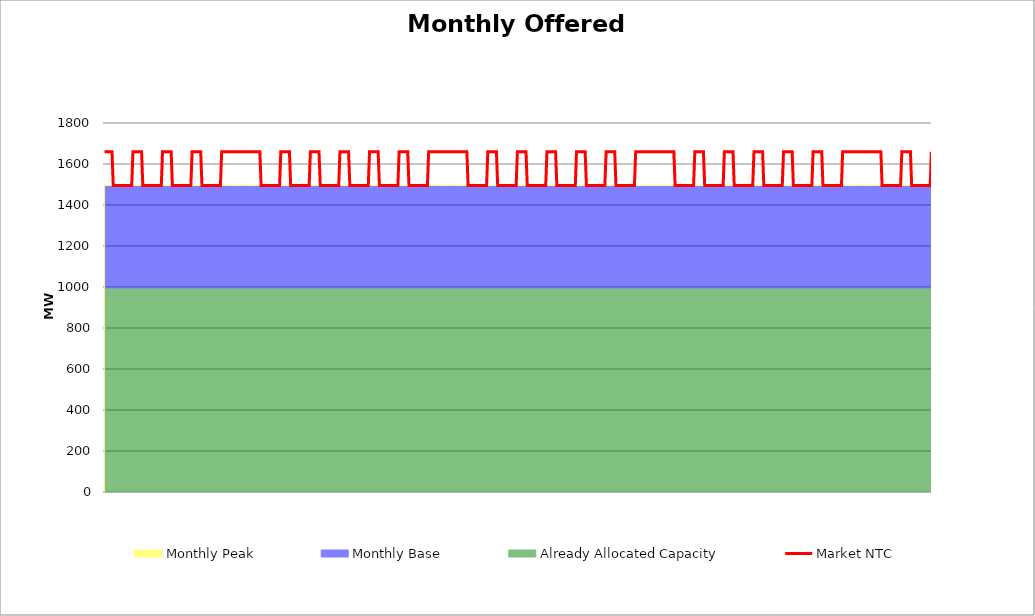
| Category | Market NTC |
|---|---|
| 0 | 1660 |
| 1 | 1660 |
| 2 | 1660 |
| 3 | 1660 |
| 4 | 1660 |
| 5 | 1660 |
| 6 | 1660 |
| 7 | 1495 |
| 8 | 1495 |
| 9 | 1495 |
| 10 | 1495 |
| 11 | 1495 |
| 12 | 1495 |
| 13 | 1495 |
| 14 | 1495 |
| 15 | 1495 |
| 16 | 1495 |
| 17 | 1495 |
| 18 | 1495 |
| 19 | 1495 |
| 20 | 1495 |
| 21 | 1495 |
| 22 | 1495 |
| 23 | 1660 |
| 24 | 1660 |
| 25 | 1660 |
| 26 | 1660 |
| 27 | 1660 |
| 28 | 1660 |
| 29 | 1660 |
| 30 | 1660 |
| 31 | 1495 |
| 32 | 1495 |
| 33 | 1495 |
| 34 | 1495 |
| 35 | 1495 |
| 36 | 1495 |
| 37 | 1495 |
| 38 | 1495 |
| 39 | 1495 |
| 40 | 1495 |
| 41 | 1495 |
| 42 | 1495 |
| 43 | 1495 |
| 44 | 1495 |
| 45 | 1495 |
| 46 | 1495 |
| 47 | 1660 |
| 48 | 1660 |
| 49 | 1660 |
| 50 | 1660 |
| 51 | 1660 |
| 52 | 1660 |
| 53 | 1660 |
| 54 | 1660 |
| 55 | 1495 |
| 56 | 1495 |
| 57 | 1495 |
| 58 | 1495 |
| 59 | 1495 |
| 60 | 1495 |
| 61 | 1495 |
| 62 | 1495 |
| 63 | 1495 |
| 64 | 1495 |
| 65 | 1495 |
| 66 | 1495 |
| 67 | 1495 |
| 68 | 1495 |
| 69 | 1495 |
| 70 | 1495 |
| 71 | 1660 |
| 72 | 1660 |
| 73 | 1660 |
| 74 | 1660 |
| 75 | 1660 |
| 76 | 1660 |
| 77 | 1660 |
| 78 | 1660 |
| 79 | 1495 |
| 80 | 1495 |
| 81 | 1495 |
| 82 | 1495 |
| 83 | 1495 |
| 84 | 1495 |
| 85 | 1495 |
| 86 | 1495 |
| 87 | 1495 |
| 88 | 1495 |
| 89 | 1495 |
| 90 | 1495 |
| 91 | 1495 |
| 92 | 1495 |
| 93 | 1495 |
| 94 | 1495 |
| 95 | 1660 |
| 96 | 1660 |
| 97 | 1660 |
| 98 | 1660 |
| 99 | 1660 |
| 100 | 1660 |
| 101 | 1660 |
| 102 | 1660 |
| 103 | 1660 |
| 104 | 1660 |
| 105 | 1660 |
| 106 | 1660 |
| 107 | 1660 |
| 108 | 1660 |
| 109 | 1660 |
| 110 | 1660 |
| 111 | 1660 |
| 112 | 1660 |
| 113 | 1660 |
| 114 | 1660 |
| 115 | 1660 |
| 116 | 1660 |
| 117 | 1660 |
| 118 | 1660 |
| 119 | 1660 |
| 120 | 1660 |
| 121 | 1660 |
| 122 | 1660 |
| 123 | 1660 |
| 124 | 1660 |
| 125 | 1660 |
| 126 | 1660 |
| 127 | 1495 |
| 128 | 1495 |
| 129 | 1495 |
| 130 | 1495 |
| 131 | 1495 |
| 132 | 1495 |
| 133 | 1495 |
| 134 | 1495 |
| 135 | 1495 |
| 136 | 1495 |
| 137 | 1495 |
| 138 | 1495 |
| 139 | 1495 |
| 140 | 1495 |
| 141 | 1495 |
| 142 | 1495 |
| 143 | 1660 |
| 144 | 1660 |
| 145 | 1660 |
| 146 | 1660 |
| 147 | 1660 |
| 148 | 1660 |
| 149 | 1660 |
| 150 | 1660 |
| 151 | 1495 |
| 152 | 1495 |
| 153 | 1495 |
| 154 | 1495 |
| 155 | 1495 |
| 156 | 1495 |
| 157 | 1495 |
| 158 | 1495 |
| 159 | 1495 |
| 160 | 1495 |
| 161 | 1495 |
| 162 | 1495 |
| 163 | 1495 |
| 164 | 1495 |
| 165 | 1495 |
| 166 | 1495 |
| 167 | 1660 |
| 168 | 1660 |
| 169 | 1660 |
| 170 | 1660 |
| 171 | 1660 |
| 172 | 1660 |
| 173 | 1660 |
| 174 | 1660 |
| 175 | 1495 |
| 176 | 1495 |
| 177 | 1495 |
| 178 | 1495 |
| 179 | 1495 |
| 180 | 1495 |
| 181 | 1495 |
| 182 | 1495 |
| 183 | 1495 |
| 184 | 1495 |
| 185 | 1495 |
| 186 | 1495 |
| 187 | 1495 |
| 188 | 1495 |
| 189 | 1495 |
| 190 | 1495 |
| 191 | 1660 |
| 192 | 1660 |
| 193 | 1660 |
| 194 | 1660 |
| 195 | 1660 |
| 196 | 1660 |
| 197 | 1660 |
| 198 | 1660 |
| 199 | 1495 |
| 200 | 1495 |
| 201 | 1495 |
| 202 | 1495 |
| 203 | 1495 |
| 204 | 1495 |
| 205 | 1495 |
| 206 | 1495 |
| 207 | 1495 |
| 208 | 1495 |
| 209 | 1495 |
| 210 | 1495 |
| 211 | 1495 |
| 212 | 1495 |
| 213 | 1495 |
| 214 | 1495 |
| 215 | 1660 |
| 216 | 1660 |
| 217 | 1660 |
| 218 | 1660 |
| 219 | 1660 |
| 220 | 1660 |
| 221 | 1660 |
| 222 | 1660 |
| 223 | 1495 |
| 224 | 1495 |
| 225 | 1495 |
| 226 | 1495 |
| 227 | 1495 |
| 228 | 1495 |
| 229 | 1495 |
| 230 | 1495 |
| 231 | 1495 |
| 232 | 1495 |
| 233 | 1495 |
| 234 | 1495 |
| 235 | 1495 |
| 236 | 1495 |
| 237 | 1495 |
| 238 | 1495 |
| 239 | 1660 |
| 240 | 1660 |
| 241 | 1660 |
| 242 | 1660 |
| 243 | 1660 |
| 244 | 1660 |
| 245 | 1660 |
| 246 | 1660 |
| 247 | 1495 |
| 248 | 1495 |
| 249 | 1495 |
| 250 | 1495 |
| 251 | 1495 |
| 252 | 1495 |
| 253 | 1495 |
| 254 | 1495 |
| 255 | 1495 |
| 256 | 1495 |
| 257 | 1495 |
| 258 | 1495 |
| 259 | 1495 |
| 260 | 1495 |
| 261 | 1495 |
| 262 | 1495 |
| 263 | 1660 |
| 264 | 1660 |
| 265 | 1660 |
| 266 | 1660 |
| 267 | 1660 |
| 268 | 1660 |
| 269 | 1660 |
| 270 | 1660 |
| 271 | 1660 |
| 272 | 1660 |
| 273 | 1660 |
| 274 | 1660 |
| 275 | 1660 |
| 276 | 1660 |
| 277 | 1660 |
| 278 | 1660 |
| 279 | 1660 |
| 280 | 1660 |
| 281 | 1660 |
| 282 | 1660 |
| 283 | 1660 |
| 284 | 1660 |
| 285 | 1660 |
| 286 | 1660 |
| 287 | 1660 |
| 288 | 1660 |
| 289 | 1660 |
| 290 | 1660 |
| 291 | 1660 |
| 292 | 1660 |
| 293 | 1660 |
| 294 | 1660 |
| 295 | 1495 |
| 296 | 1495 |
| 297 | 1495 |
| 298 | 1495 |
| 299 | 1495 |
| 300 | 1495 |
| 301 | 1495 |
| 302 | 1495 |
| 303 | 1495 |
| 304 | 1495 |
| 305 | 1495 |
| 306 | 1495 |
| 307 | 1495 |
| 308 | 1495 |
| 309 | 1495 |
| 310 | 1495 |
| 311 | 1660 |
| 312 | 1660 |
| 313 | 1660 |
| 314 | 1660 |
| 315 | 1660 |
| 316 | 1660 |
| 317 | 1660 |
| 318 | 1660 |
| 319 | 1495 |
| 320 | 1495 |
| 321 | 1495 |
| 322 | 1495 |
| 323 | 1495 |
| 324 | 1495 |
| 325 | 1495 |
| 326 | 1495 |
| 327 | 1495 |
| 328 | 1495 |
| 329 | 1495 |
| 330 | 1495 |
| 331 | 1495 |
| 332 | 1495 |
| 333 | 1495 |
| 334 | 1495 |
| 335 | 1660 |
| 336 | 1660 |
| 337 | 1660 |
| 338 | 1660 |
| 339 | 1660 |
| 340 | 1660 |
| 341 | 1660 |
| 342 | 1660 |
| 343 | 1495 |
| 344 | 1495 |
| 345 | 1495 |
| 346 | 1495 |
| 347 | 1495 |
| 348 | 1495 |
| 349 | 1495 |
| 350 | 1495 |
| 351 | 1495 |
| 352 | 1495 |
| 353 | 1495 |
| 354 | 1495 |
| 355 | 1495 |
| 356 | 1495 |
| 357 | 1495 |
| 358 | 1495 |
| 359 | 1660 |
| 360 | 1660 |
| 361 | 1660 |
| 362 | 1660 |
| 363 | 1660 |
| 364 | 1660 |
| 365 | 1660 |
| 366 | 1660 |
| 367 | 1495 |
| 368 | 1495 |
| 369 | 1495 |
| 370 | 1495 |
| 371 | 1495 |
| 372 | 1495 |
| 373 | 1495 |
| 374 | 1495 |
| 375 | 1495 |
| 376 | 1495 |
| 377 | 1495 |
| 378 | 1495 |
| 379 | 1495 |
| 380 | 1495 |
| 381 | 1495 |
| 382 | 1495 |
| 383 | 1660 |
| 384 | 1660 |
| 385 | 1660 |
| 386 | 1660 |
| 387 | 1660 |
| 388 | 1660 |
| 389 | 1660 |
| 390 | 1660 |
| 391 | 1495 |
| 392 | 1495 |
| 393 | 1495 |
| 394 | 1495 |
| 395 | 1495 |
| 396 | 1495 |
| 397 | 1495 |
| 398 | 1495 |
| 399 | 1495 |
| 400 | 1495 |
| 401 | 1495 |
| 402 | 1495 |
| 403 | 1495 |
| 404 | 1495 |
| 405 | 1495 |
| 406 | 1495 |
| 407 | 1660 |
| 408 | 1660 |
| 409 | 1660 |
| 410 | 1660 |
| 411 | 1660 |
| 412 | 1660 |
| 413 | 1660 |
| 414 | 1660 |
| 415 | 1495 |
| 416 | 1495 |
| 417 | 1495 |
| 418 | 1495 |
| 419 | 1495 |
| 420 | 1495 |
| 421 | 1495 |
| 422 | 1495 |
| 423 | 1495 |
| 424 | 1495 |
| 425 | 1495 |
| 426 | 1495 |
| 427 | 1495 |
| 428 | 1495 |
| 429 | 1495 |
| 430 | 1495 |
| 431 | 1660 |
| 432 | 1660 |
| 433 | 1660 |
| 434 | 1660 |
| 435 | 1660 |
| 436 | 1660 |
| 437 | 1660 |
| 438 | 1660 |
| 439 | 1660 |
| 440 | 1660 |
| 441 | 1660 |
| 442 | 1660 |
| 443 | 1660 |
| 444 | 1660 |
| 445 | 1660 |
| 446 | 1660 |
| 447 | 1660 |
| 448 | 1660 |
| 449 | 1660 |
| 450 | 1660 |
| 451 | 1660 |
| 452 | 1660 |
| 453 | 1660 |
| 454 | 1660 |
| 455 | 1660 |
| 456 | 1660 |
| 457 | 1660 |
| 458 | 1660 |
| 459 | 1660 |
| 460 | 1660 |
| 461 | 1660 |
| 462 | 1660 |
| 463 | 1495 |
| 464 | 1495 |
| 465 | 1495 |
| 466 | 1495 |
| 467 | 1495 |
| 468 | 1495 |
| 469 | 1495 |
| 470 | 1495 |
| 471 | 1495 |
| 472 | 1495 |
| 473 | 1495 |
| 474 | 1495 |
| 475 | 1495 |
| 476 | 1495 |
| 477 | 1495 |
| 478 | 1495 |
| 479 | 1660 |
| 480 | 1660 |
| 481 | 1660 |
| 482 | 1660 |
| 483 | 1660 |
| 484 | 1660 |
| 485 | 1660 |
| 486 | 1660 |
| 487 | 1495 |
| 488 | 1495 |
| 489 | 1495 |
| 490 | 1495 |
| 491 | 1495 |
| 492 | 1495 |
| 493 | 1495 |
| 494 | 1495 |
| 495 | 1495 |
| 496 | 1495 |
| 497 | 1495 |
| 498 | 1495 |
| 499 | 1495 |
| 500 | 1495 |
| 501 | 1495 |
| 502 | 1495 |
| 503 | 1660 |
| 504 | 1660 |
| 505 | 1660 |
| 506 | 1660 |
| 507 | 1660 |
| 508 | 1660 |
| 509 | 1660 |
| 510 | 1660 |
| 511 | 1495 |
| 512 | 1495 |
| 513 | 1495 |
| 514 | 1495 |
| 515 | 1495 |
| 516 | 1495 |
| 517 | 1495 |
| 518 | 1495 |
| 519 | 1495 |
| 520 | 1495 |
| 521 | 1495 |
| 522 | 1495 |
| 523 | 1495 |
| 524 | 1495 |
| 525 | 1495 |
| 526 | 1495 |
| 527 | 1660 |
| 528 | 1660 |
| 529 | 1660 |
| 530 | 1660 |
| 531 | 1660 |
| 532 | 1660 |
| 533 | 1660 |
| 534 | 1660 |
| 535 | 1495 |
| 536 | 1495 |
| 537 | 1495 |
| 538 | 1495 |
| 539 | 1495 |
| 540 | 1495 |
| 541 | 1495 |
| 542 | 1495 |
| 543 | 1495 |
| 544 | 1495 |
| 545 | 1495 |
| 546 | 1495 |
| 547 | 1495 |
| 548 | 1495 |
| 549 | 1495 |
| 550 | 1495 |
| 551 | 1660 |
| 552 | 1660 |
| 553 | 1660 |
| 554 | 1660 |
| 555 | 1660 |
| 556 | 1660 |
| 557 | 1660 |
| 558 | 1660 |
| 559 | 1495 |
| 560 | 1495 |
| 561 | 1495 |
| 562 | 1495 |
| 563 | 1495 |
| 564 | 1495 |
| 565 | 1495 |
| 566 | 1495 |
| 567 | 1495 |
| 568 | 1495 |
| 569 | 1495 |
| 570 | 1495 |
| 571 | 1495 |
| 572 | 1495 |
| 573 | 1495 |
| 574 | 1495 |
| 575 | 1660 |
| 576 | 1660 |
| 577 | 1660 |
| 578 | 1660 |
| 579 | 1660 |
| 580 | 1660 |
| 581 | 1660 |
| 582 | 1660 |
| 583 | 1495 |
| 584 | 1495 |
| 585 | 1495 |
| 586 | 1495 |
| 587 | 1495 |
| 588 | 1495 |
| 589 | 1495 |
| 590 | 1495 |
| 591 | 1495 |
| 592 | 1495 |
| 593 | 1495 |
| 594 | 1495 |
| 595 | 1495 |
| 596 | 1495 |
| 597 | 1495 |
| 598 | 1495 |
| 599 | 1660 |
| 600 | 1660 |
| 601 | 1660 |
| 602 | 1660 |
| 603 | 1660 |
| 604 | 1660 |
| 605 | 1660 |
| 606 | 1660 |
| 607 | 1660 |
| 608 | 1660 |
| 609 | 1660 |
| 610 | 1660 |
| 611 | 1660 |
| 612 | 1660 |
| 613 | 1660 |
| 614 | 1660 |
| 615 | 1660 |
| 616 | 1660 |
| 617 | 1660 |
| 618 | 1660 |
| 619 | 1660 |
| 620 | 1660 |
| 621 | 1660 |
| 622 | 1660 |
| 623 | 1660 |
| 624 | 1660 |
| 625 | 1660 |
| 626 | 1660 |
| 627 | 1660 |
| 628 | 1660 |
| 629 | 1660 |
| 630 | 1660 |
| 631 | 1495 |
| 632 | 1495 |
| 633 | 1495 |
| 634 | 1495 |
| 635 | 1495 |
| 636 | 1495 |
| 637 | 1495 |
| 638 | 1495 |
| 639 | 1495 |
| 640 | 1495 |
| 641 | 1495 |
| 642 | 1495 |
| 643 | 1495 |
| 644 | 1495 |
| 645 | 1495 |
| 646 | 1495 |
| 647 | 1660 |
| 648 | 1660 |
| 649 | 1660 |
| 650 | 1660 |
| 651 | 1660 |
| 652 | 1660 |
| 653 | 1660 |
| 654 | 1660 |
| 655 | 1495 |
| 656 | 1495 |
| 657 | 1495 |
| 658 | 1495 |
| 659 | 1495 |
| 660 | 1495 |
| 661 | 1495 |
| 662 | 1495 |
| 663 | 1495 |
| 664 | 1495 |
| 665 | 1495 |
| 666 | 1495 |
| 667 | 1495 |
| 668 | 1495 |
| 669 | 1495 |
| 670 | 1495 |
| 671 | 1660 |